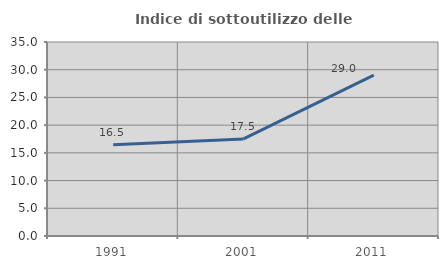
| Category | Indice di sottoutilizzo delle abitazioni  |
|---|---|
| 1991.0 | 16.46 |
| 2001.0 | 17.522 |
| 2011.0 | 29.009 |